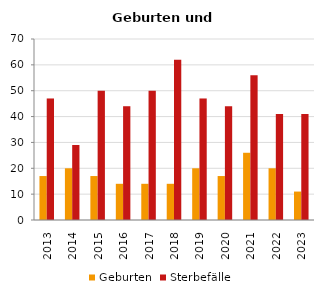
| Category | Geburten | Sterbefälle |
|---|---|---|
| 2013.0 | 17 | 47 |
| 2014.0 | 20 | 29 |
| 2015.0 | 17 | 50 |
| 2016.0 | 14 | 44 |
| 2017.0 | 14 | 50 |
| 2018.0 | 14 | 62 |
| 2019.0 | 20 | 47 |
| 2020.0 | 17 | 44 |
| 2021.0 | 26 | 56 |
| 2022.0 | 20 | 41 |
| 2023.0 | 11 | 41 |